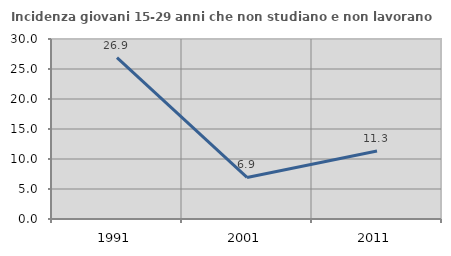
| Category | Incidenza giovani 15-29 anni che non studiano e non lavorano  |
|---|---|
| 1991.0 | 26.882 |
| 2001.0 | 6.932 |
| 2011.0 | 11.332 |